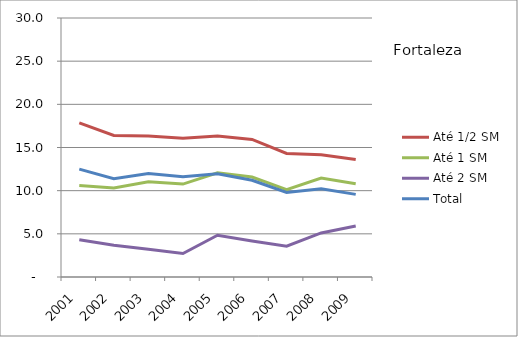
| Category | Até 1/2 SM | Até 1 SM | Até 2 SM | Total |
|---|---|---|---|---|
| 2001.0 | 17.86 | 10.61 | 4.31 | 12.5 |
| 2002.0 | 16.4 | 10.31 | 3.68 | 11.39 |
| 2003.0 | 16.32 | 11.02 | 3.21 | 11.98 |
| 2004.0 | 16.08 | 10.76 | 2.72 | 11.6 |
| 2005.0 | 16.34 | 12.08 | 4.84 | 11.96 |
| 2006.0 | 15.93 | 11.58 | 4.17 | 11.2 |
| 2007.0 | 14.31 | 10.12 | 3.56 | 9.8 |
| 2008.0 | 14.16 | 11.46 | 5.1 | 10.21 |
| 2009.0 | 13.62 | 10.8 | 5.91 | 9.57 |